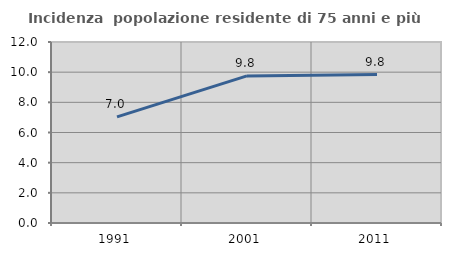
| Category | Incidenza  popolazione residente di 75 anni e più |
|---|---|
| 1991.0 | 7.04 |
| 2001.0 | 9.752 |
| 2011.0 | 9.84 |